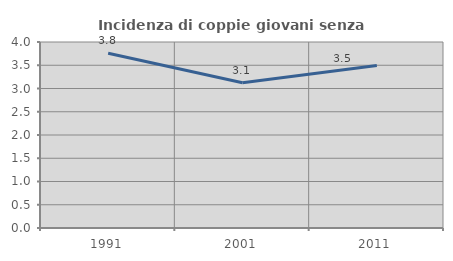
| Category | Incidenza di coppie giovani senza figli |
|---|---|
| 1991.0 | 3.759 |
| 2001.0 | 3.125 |
| 2011.0 | 3.497 |